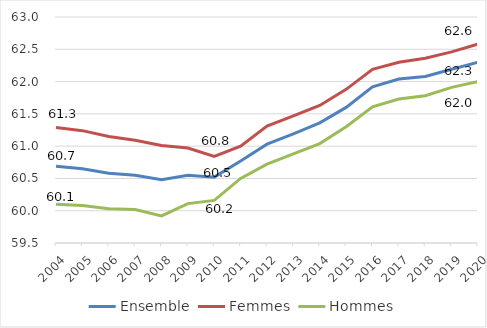
| Category | Ensemble | Femmes | Hommes |
|---|---|---|---|
| 2004.0 | 60.69 | 61.29 | 60.1 |
| 2005.0 | 60.65 | 61.24 | 60.08 |
| 2006.0 | 60.58 | 61.15 | 60.03 |
| 2007.0 | 60.55 | 61.09 | 60.02 |
| 2008.0 | 60.48 | 61.01 | 59.92 |
| 2009.0 | 60.55 | 60.97 | 60.11 |
| 2010.0 | 60.52 | 60.84 | 60.16 |
| 2011.0 | 60.77 | 61 | 60.5 |
| 2012.0 | 61.03 | 61.31 | 60.72 |
| 2013.0 | 61.19 | 61.47 | 60.88 |
| 2014.0 | 61.36 | 61.63 | 61.04 |
| 2015.0 | 61.6 | 61.88 | 61.3 |
| 2016.0 | 61.92 | 62.19 | 61.61 |
| 2017.0 | 62.04 | 62.3 | 61.73 |
| 2018.0 | 62.08 | 62.36 | 61.78 |
| 2019.0 | 62.19 | 62.46 | 61.91 |
| 2020.0 | 62.3 | 62.58 | 62 |